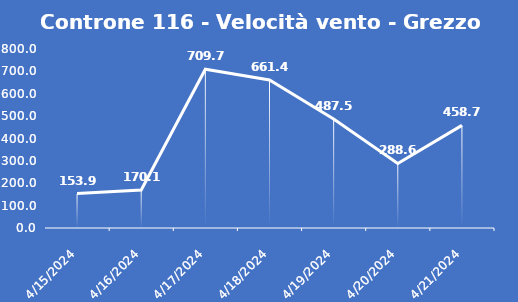
| Category | Controne 116 - Velocità vento - Grezzo (min) |
|---|---|
| 4/15/24 | 153.9 |
| 4/16/24 | 170.1 |
| 4/17/24 | 709.7 |
| 4/18/24 | 661.4 |
| 4/19/24 | 487.5 |
| 4/20/24 | 288.6 |
| 4/21/24 | 458.7 |